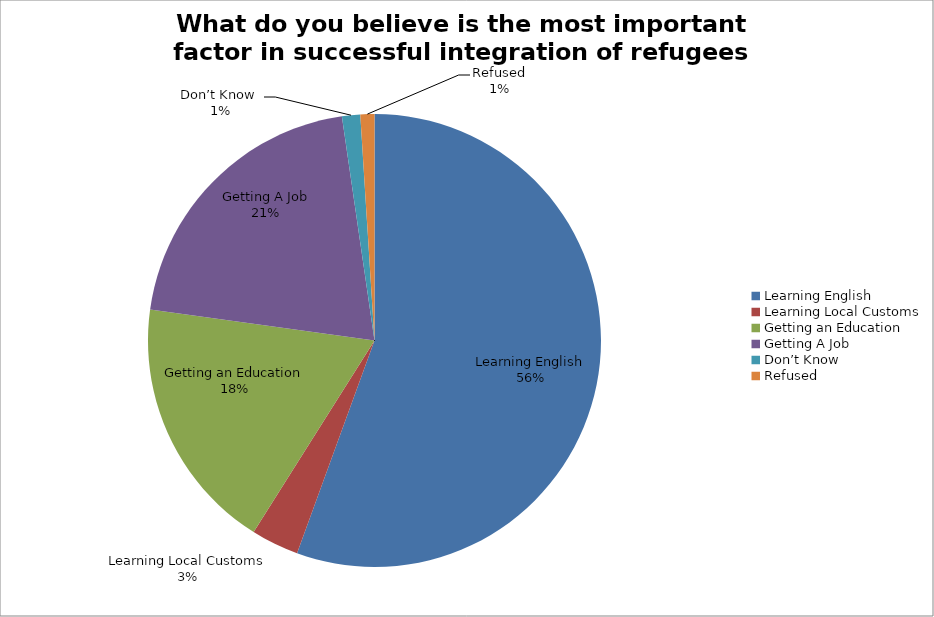
| Category | Valid Percent | Percent | Frequency |
|---|---|---|---|
| Learning English | 55.5 | 55.5 | 331 |
| Learning Local Customs | 3.4 | 3.4 | 20 |
| Getting an Education | 18.2 | 18.3 | 109 |
| Getting A Job | 20.5 | 20.5 | 122 |
| Don’t Know  | 1.3 | 1.3 | 8 |
| Refused | 1 | 1 | 6 |